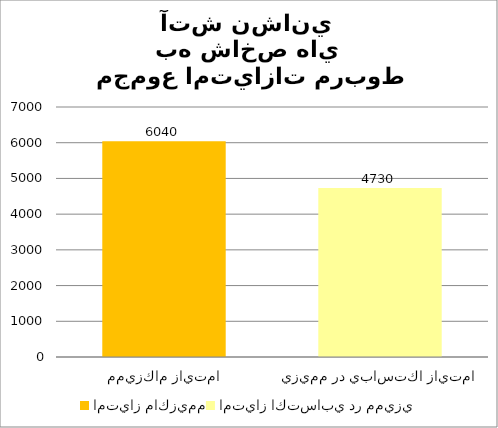
| Category | مجموع امتيازات مربوط به شاخص هاي آتش نشاني  |
|---|---|
| امتياز ماكزيمم | 6040 |
| امتياز اكتسابي در مميزي | 4730 |